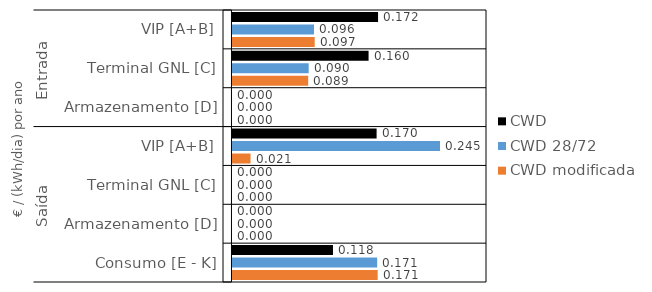
| Category | CWD | CWD 28/72 | CWD modificada |
|---|---|---|---|
| 0 | 0.172 | 0.096 | 0.097 |
| 1 | 0.16 | 0.09 | 0.089 |
| 2 | 0 | 0 | 0 |
| 3 | 0.17 | 0.245 | 0.021 |
| 4 | 0 | 0 | 0 |
| 5 | 0 | 0 | 0 |
| 6 | 0.118 | 0.171 | 0.171 |